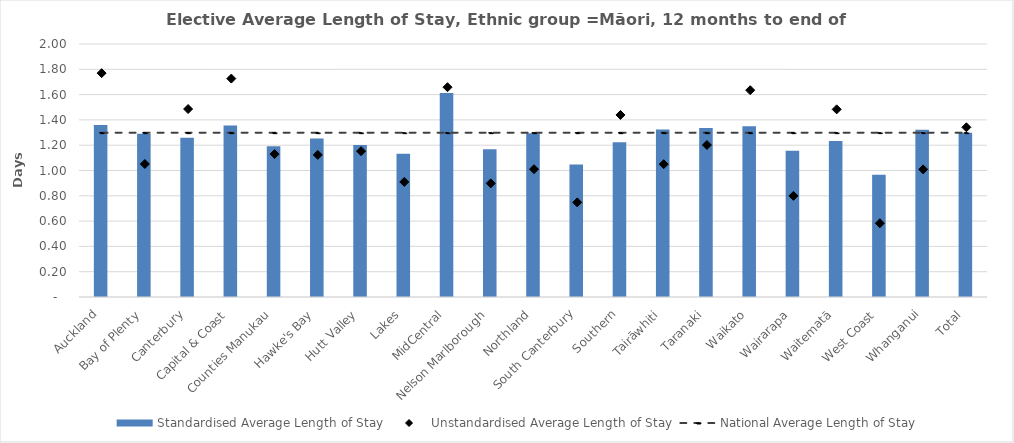
| Category | Standardised Average Length of Stay |
|---|---|
| Auckland | 1.36 |
| Bay of Plenty | 1.29 |
| Canterbury | 1.258 |
| Capital & Coast | 1.355 |
| Counties Manukau | 1.191 |
| Hawke's Bay | 1.254 |
| Hutt Valley | 1.201 |
| Lakes | 1.132 |
| MidCentral | 1.612 |
| Nelson Marlborough | 1.168 |
| Northland | 1.295 |
| South Canterbury | 1.048 |
| Southern | 1.223 |
| Tairāwhiti | 1.325 |
| Taranaki | 1.336 |
| Waikato | 1.35 |
| Wairarapa | 1.156 |
| Waitematā | 1.232 |
| West Coast | 0.967 |
| Whanganui | 1.322 |
| Total | 1.299 |